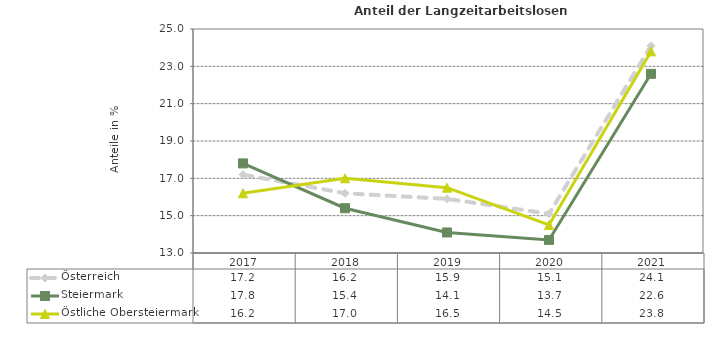
| Category | Österreich | Steiermark | Östliche Obersteiermark |
|---|---|---|---|
| 2021.0 | 24.1 | 22.6 | 23.8 |
| 2020.0 | 15.1 | 13.7 | 14.5 |
| 2019.0 | 15.9 | 14.1 | 16.5 |
| 2018.0 | 16.2 | 15.4 | 17 |
| 2017.0 | 17.2 | 17.8 | 16.2 |